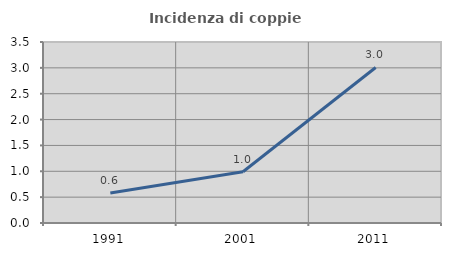
| Category | Incidenza di coppie miste |
|---|---|
| 1991.0 | 0.582 |
| 2001.0 | 0.99 |
| 2011.0 | 3.008 |